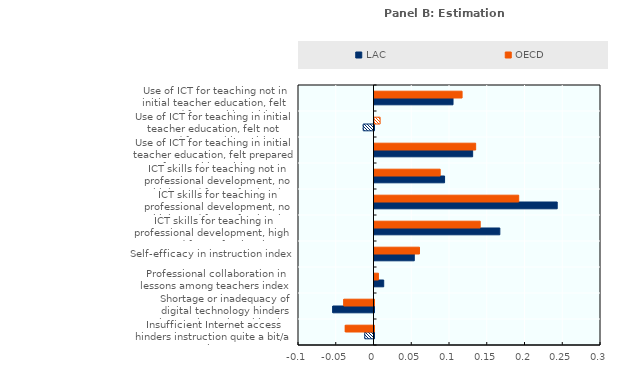
| Category | LAC | OECD |
|---|---|---|
| Insufficient Internet access hinders instruction quite a bit/a lot | -0.012 | -0.038 |
| Shortage or inadequacy of digital technology hinders instruction quite a bit/a lot | -0.055 | -0.04 |
| Professional collaboration in lessons among teachers index | 0.012 | 0.005 |
| Self-efficacy in instruction index | 0.053 | 0.06 |
| ICT skills for teaching in professional development, high need for professional development in ICT skills for teaching | 0.166 | 0.14 |
| ICT skills for teaching in professional development, no high need for professional development in ICT skills for teaching | 0.242 | 0.191 |
| ICT skills for teaching not in professional development, no high need for professional development in ICT skills for teaching | 0.093 | 0.087 |
| Use of ICT for teaching in initial teacher education, felt prepared for teaching with ICT | 0.13 | 0.134 |
| Use of ICT for teaching in initial teacher education, felt not prepared for teaching with ICT | -0.014 | 0.007 |
| Use of ICT for teaching not in initial teacher education, felt  prepared for teaching with ICT | 0.104 | 0.116 |